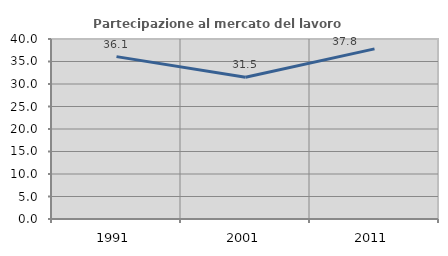
| Category | Partecipazione al mercato del lavoro  femminile |
|---|---|
| 1991.0 | 36.081 |
| 2001.0 | 31.499 |
| 2011.0 | 37.806 |